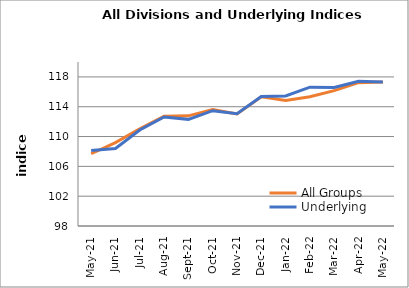
| Category | All Groups | Underlying |
|---|---|---|
| 2021-05-01 | 107.693 | 108.128 |
| 2021-06-01 | 109.193 | 108.399 |
| 2021-07-01 | 111.039 | 110.883 |
| 2021-08-01 | 112.735 | 112.633 |
| 2021-09-01 | 112.778 | 112.306 |
| 2021-10-01 | 113.609 | 113.469 |
| 2021-11-01 | 113.04 | 113.069 |
| 2021-12-01 | 115.332 | 115.373 |
| 2022-01-01 | 114.841 | 115.444 |
| 2022-02-01 | 115.348 | 116.622 |
| 2022-03-01 | 116.161 | 116.584 |
| 2022-04-01 | 117.224 | 117.408 |
| 2022-05-01 | 117.307 | 117.327 |